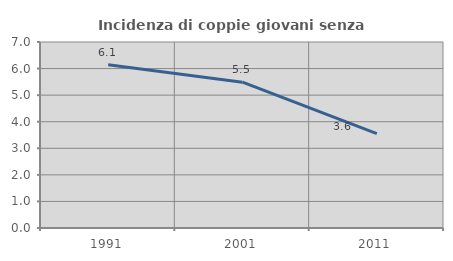
| Category | Incidenza di coppie giovani senza figli |
|---|---|
| 1991.0 | 6.143 |
| 2001.0 | 5.488 |
| 2011.0 | 3.555 |